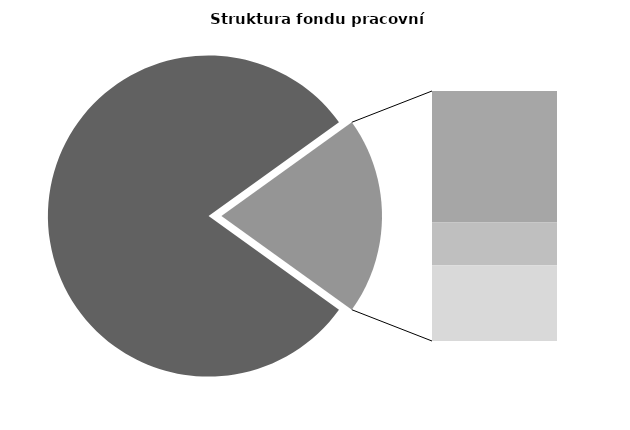
| Category | Series 0 |
|---|---|
| Průměrná měsíční odpracovaná doba bez přesčasu | 137.994 |
| Dovolená | 17.968 |
| Nemoc | 5.827 |
| Jiné | 10.355 |